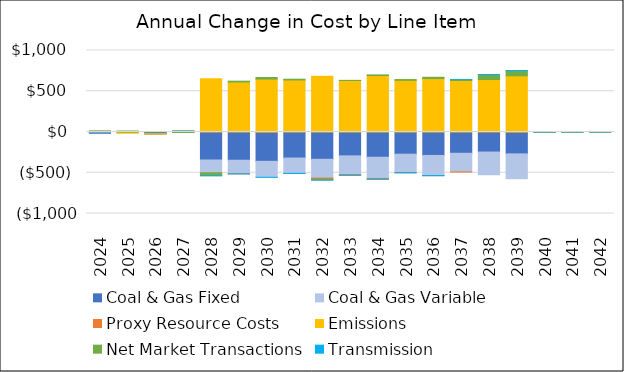
| Category | Coal & Gas Fixed | Coal & Gas Variable | Proxy Resource Costs | Emissions | Net Market Transactions | Transmission |
|---|---|---|---|---|---|---|
| 2024.0 | -15.771 | 7.415 | 0.322 | 0.91 | 4.926 | 0 |
| 2025.0 | 0.911 | -8.329 | 0.056 | -6.034 | 11.459 | 0 |
| 2026.0 | -22.994 | -1.066 | -0.043 | -0.619 | 0.658 | 0 |
| 2027.0 | 8.278 | 1.614 | 0.016 | 2.253 | -6.269 | 0 |
| 2028.0 | -343.465 | -158.277 | -1.125 | 653.601 | -33.576 | -0.002 |
| 2029.0 | -346.516 | -165.876 | -1.106 | 613.583 | 10.252 | -0.029 |
| 2030.0 | -359.682 | -196.042 | 0.115 | 649.611 | 19.239 | -0.037 |
| 2031.0 | -319.563 | -188.726 | -0.084 | 638.229 | 9.531 | -0.653 |
| 2032.0 | -334.884 | -229.963 | -14.493 | 684.429 | -9.952 | -0.391 |
| 2033.0 | -293.105 | -229.057 | -7.765 | 632.258 | 1.523 | -1.474 |
| 2034.0 | -309.843 | -260.248 | -7.828 | 692.161 | 8.528 | -1.507 |
| 2035.0 | -272.125 | -225.902 | -1.531 | 634.191 | 9.128 | -1.542 |
| 2036.0 | -287.783 | -246.075 | -0.961 | 655.46 | 15.917 | -1.59 |
| 2037.0 | -261.175 | -227.997 | -1.325 | 631.896 | 10.928 | 0.168 |
| 2038.0 | -246.083 | -278.311 | 2.634 | 641.098 | 61.216 | 0.31 |
| 2039.0 | -268.433 | -304.68 | 1.145 | 688.108 | 63.9 | 0.317 |
| 2040.0 | -0.227 | 0.173 | -0.005 | 0.041 | -0.443 | 0.18 |
| 2041.0 | 0 | 0.343 | -0.002 | 0.124 | -0.797 | 0.218 |
| 2042.0 | 0 | 0.097 | -0.001 | 0.102 | -0.062 | 0.038 |